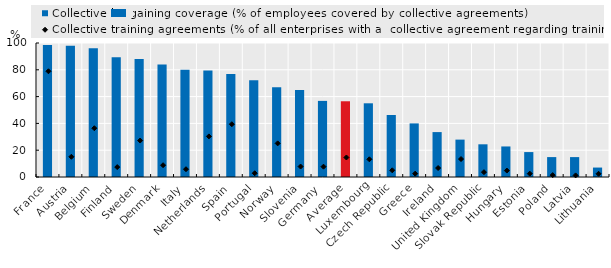
| Category | Collective bargaining coverage (% of employees covered by collective agreements) |
|---|---|
| France | 98.457 |
| Austria | 98 |
| Belgium | 96 |
| Finland | 89.315 |
| Sweden | 88 |
| Denmark | 84 |
| Italy | 80 |
| Netherlands | 79.408 |
| Spain | 76.931 |
| Portugal | 72.262 |
| Norway | 67 |
| Slovenia | 65 |
| Germany  | 56.8 |
| Average | 56.517 |
| Luxembourg | 55 |
| Czech Republic | 46.27 |
| Greece | 40 |
| Ireland | 33.515 |
| United Kingdom | 27.9 |
| Slovak Republic | 24.4 |
| Hungary | 22.797 |
| Estonia | 18.6 |
| Poland | 14.855 |
| Latvia | 14.85 |
| Lithuania | 7.05 |